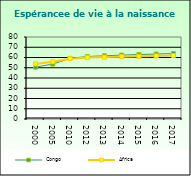
| Category | Congo | Africa                        |
|---|---|---|
| 2000.0 | 50.617 | 53.721 |
| 2005.0 | 53.591 | 55.757 |
| 2010.0 | 59.172 | 58.857 |
| 2012.0 | 60.951 | 59.91 |
| 2013.0 | 61.692 | 60.376 |
| 2014.0 | 62.336 | 60.801 |
| 2015.0 | 62.892 | 61.187 |
| 2016.0 | 63.377 | 61.538 |
| 2017.0 | 63.818 | 61.865 |